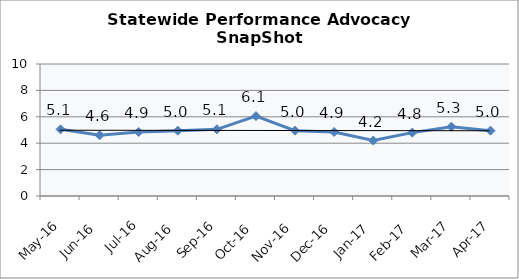
| Category | Statewide |
|---|---|
| May-16 | 5.05 |
| Jun-16 | 4.6 |
| Jul-16 | 4.85 |
| Aug-16 | 4.95 |
| Sep-16 | 5.05 |
| Oct-16 | 6.05 |
| Nov-16 | 4.95 |
| Dec-16 | 4.85 |
| Jan-17 | 4.2 |
| Feb-17 | 4.8 |
| Mar-17 | 5.25 |
| Apr-17 | 4.95 |